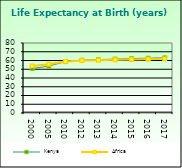
| Category | Kenya | Africa                        |
|---|---|---|
| 2000.0 | 50.812 | 53.721 |
| 2005.0 | 53.561 | 55.757 |
| 2010.0 | 58.76 | 58.857 |
| 2012.0 | 60.31 | 59.91 |
| 2013.0 | 60.989 | 60.376 |
| 2014.0 | 61.609 | 60.801 |
| 2015.0 | 62.164 | 61.187 |
| 2016.0 | 62.647 | 61.538 |
| 2017.0 | 63.062 | 61.865 |